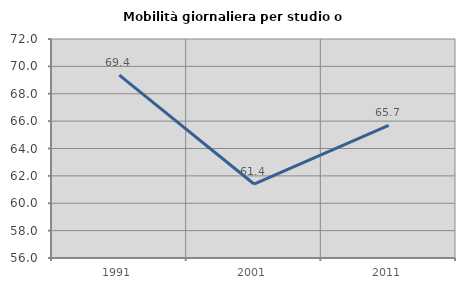
| Category | Mobilità giornaliera per studio o lavoro |
|---|---|
| 1991.0 | 69.362 |
| 2001.0 | 61.404 |
| 2011.0 | 65.69 |